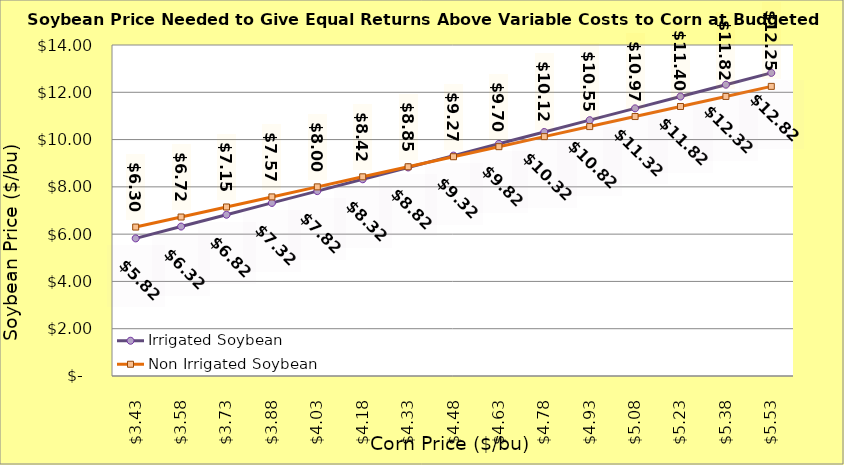
| Category | Irrigated Soybean | Non Irrigated Soybean |
|---|---|---|
| 3.4299999999999997 | 5.821 | 6.299 |
| 3.5799999999999996 | 6.321 | 6.724 |
| 3.7299999999999995 | 6.821 | 7.149 |
| 3.8799999999999994 | 7.321 | 7.574 |
| 4.029999999999999 | 7.821 | 7.999 |
| 4.18 | 8.321 | 8.424 |
| 4.33 | 8.821 | 8.849 |
| 4.48 | 9.321 | 9.274 |
| 4.630000000000001 | 9.821 | 9.699 |
| 4.780000000000001 | 10.321 | 10.124 |
| 4.9300000000000015 | 10.821 | 10.549 |
| 5.080000000000002 | 11.321 | 10.974 |
| 5.230000000000002 | 11.821 | 11.399 |
| 5.380000000000003 | 12.321 | 11.824 |
| 5.530000000000003 | 12.821 | 12.249 |